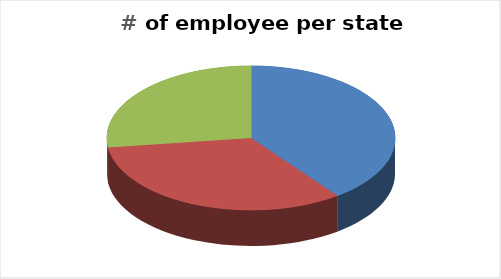
| Category | # |
|---|---|
| PA | 148 |
| IL | 123 |
| NE | 101 |